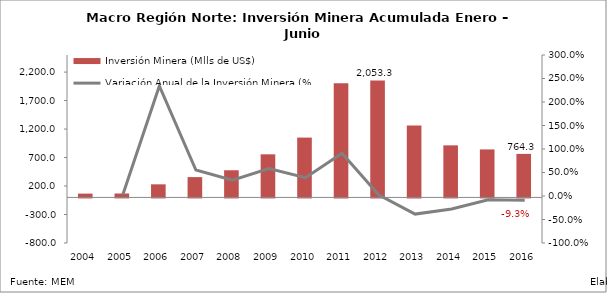
| Category | Inversión Minera (Mlls de US$) |
|---|---|
| 2004.0 | 66.913 |
| 2005.0 | 68.83 |
| 2006.0 | 229.925 |
| 2007.0 | 356.858 |
| 2008.0 | 476.996 |
| 2009.0 | 756.521 |
| 2010.0 | 1050.32 |
| 2011.0 | 2003.968 |
| 2012.0 | 2053.335 |
| 2013.0 | 1262.746 |
| 2014.0 | 914.056 |
| 2015.0 | 842.502 |
| 2016.0 | 764.267 |